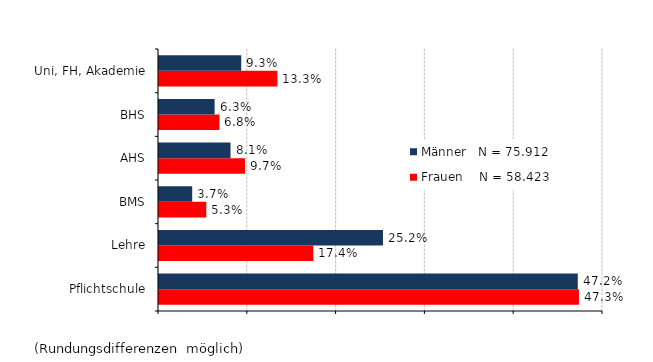
| Category | Frauen    N = 58.423 | Männer   N = 75.912 |
|---|---|---|
| Pflichtschule | 0.473 | 0.472 |
| Lehre | 0.174 | 0.252 |
| BMS | 0.053 | 0.037 |
| AHS | 0.097 | 0.081 |
| BHS | 0.068 | 0.063 |
| Uni, FH, Akademie | 0.133 | 0.093 |